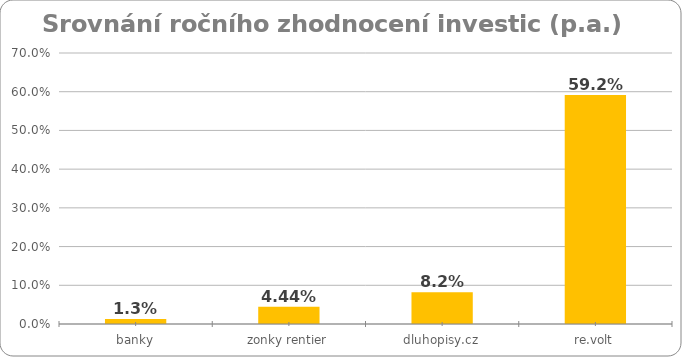
| Category | Series 0 |
|---|---|
| banky | 0.013 |
| zonky rentier | 0.044 |
| dluhopisy.cz | 0.082 |
| re.volt | 0.592 |